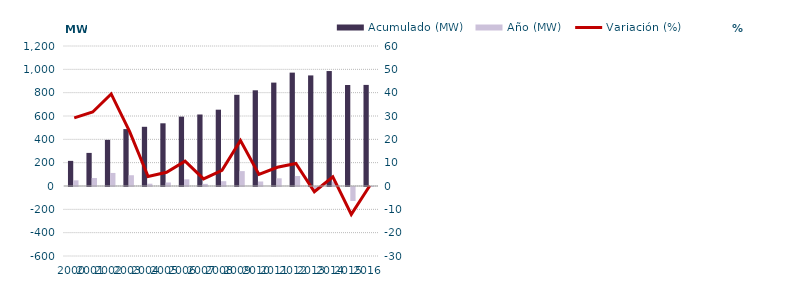
| Category | Acumulado (MW) | Año (MW) |
|---|---|---|
| 2000.0 | 215.387 | 48.641 |
| 2001.0 | 283.668 | 68.281 |
| 2002.0 | 395.622 | 111.954 |
| 2003.0 | 487.774 | 92.151 |
| 2004.0 | 507.505 | 19.731 |
| 2005.0 | 537.458 | 29.953 |
| 2006.0 | 594.724 | 57.267 |
| 2007.0 | 612.965 | 18.24 |
| 2008.0 | 654.063 | 41.098 |
| 2009.0 | 781.673 | 127.61 |
| 2010.0 | 820.352 | 38.679 |
| 2011.0 | 886.288 | 65.936 |
| 2012.0 | 971.8 | 85.512 |
| 2013.0 | 947.81 | -23.99 |
| 2014.0 | 985.333 | 37.523 |
| 2015.0 | 865.576 | -119.757 |
| 2016.0 | 866.531 | 0.955 |